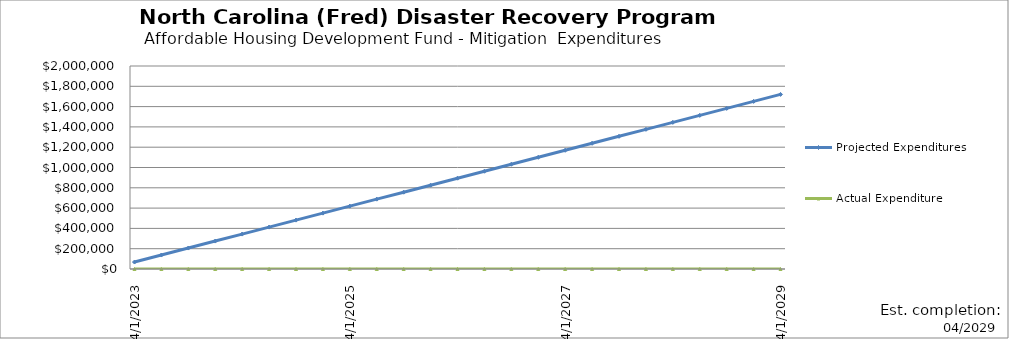
| Category | Projected Expenditures | Actual Expenditure |
|---|---|---|
| 4/1/23 | 68800 | 0 |
| 7/1/23 | 137600 | 0 |
| 10/1/23 | 206400 | 0 |
| 1/1/24 | 275200 | 0 |
| 4/1/24 | 344000 | 0 |
| 7/1/24 | 412800 | 0 |
| 10/1/24 | 481600 | 0 |
| 1/1/25 | 550400 | 0 |
| 4/1/25 | 619200 | 0 |
| 7/1/25 | 688000 | 0 |
| 10/1/25 | 756800 | 0 |
| 1/1/26 | 825600 | 0 |
| 4/1/26 | 894400 | 0 |
| 7/1/26 | 963200 | 0 |
| 10/1/26 | 1032000 | 0 |
| 1/1/27 | 1100800 | 0 |
| 4/1/27 | 1169600 | 0 |
| 7/1/27 | 1238400 | 0 |
| 10/1/27 | 1307200 | 0 |
| 1/1/28 | 1376000 | 0 |
| 4/1/28 | 1444800 | 0 |
| 7/1/28 | 1513600 | 0 |
| 10/1/28 | 1582400 | 0 |
| 1/1/29 | 1651200 | 0 |
| 4/1/29 | 1720000 | 0 |